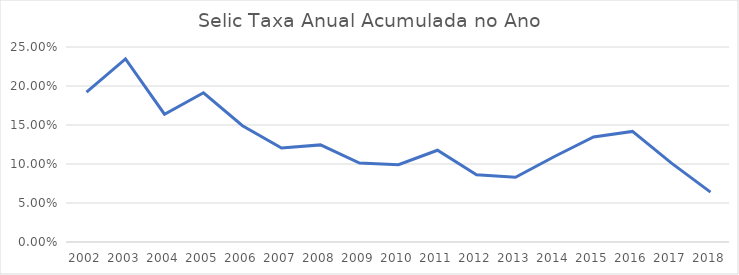
| Category | Selic |
|---|---|
| 2002.0 | 0.192 |
| 2003.0 | 0.235 |
| 2004.0 | 0.164 |
| 2005.0 | 0.191 |
| 2006.0 | 0.149 |
| 2007.0 | 0.12 |
| 2008.0 | 0.124 |
| 2009.0 | 0.101 |
| 2010.0 | 0.099 |
| 2011.0 | 0.118 |
| 2012.0 | 0.086 |
| 2013.0 | 0.083 |
| 2014.0 | 0.11 |
| 2015.0 | 0.135 |
| 2016.0 | 0.142 |
| 2017.0 | 0.101 |
| 2018.0 | 0.064 |